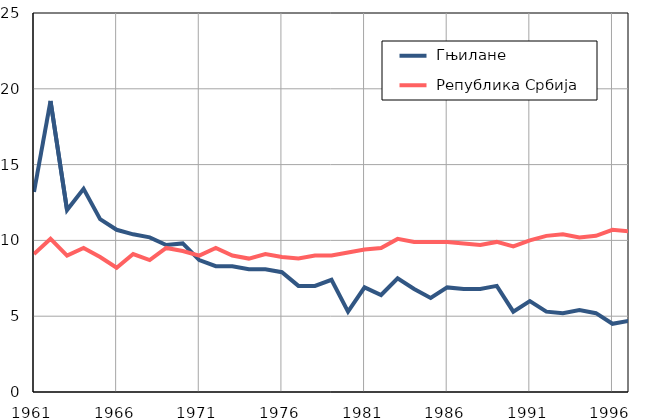
| Category |  Гњилане |  Република Србија |
|---|---|---|
| 1961.0 | 13.2 | 9.1 |
| 1962.0 | 19.2 | 10.1 |
| 1963.0 | 12 | 9 |
| 1964.0 | 13.4 | 9.5 |
| 1965.0 | 11.4 | 8.9 |
| 1966.0 | 10.7 | 8.2 |
| 1967.0 | 10.4 | 9.1 |
| 1968.0 | 10.2 | 8.7 |
| 1969.0 | 9.7 | 9.5 |
| 1970.0 | 9.8 | 9.3 |
| 1971.0 | 8.7 | 9 |
| 1972.0 | 8.3 | 9.5 |
| 1973.0 | 8.3 | 9 |
| 1974.0 | 8.1 | 8.8 |
| 1975.0 | 8.1 | 9.1 |
| 1976.0 | 7.9 | 8.9 |
| 1977.0 | 7 | 8.8 |
| 1978.0 | 7 | 9 |
| 1979.0 | 7.4 | 9 |
| 1980.0 | 5.3 | 9.2 |
| 1981.0 | 6.9 | 9.4 |
| 1982.0 | 6.4 | 9.5 |
| 1983.0 | 7.5 | 10.1 |
| 1984.0 | 6.8 | 9.9 |
| 1985.0 | 6.2 | 9.9 |
| 1986.0 | 6.9 | 9.9 |
| 1987.0 | 6.8 | 9.8 |
| 1988.0 | 6.8 | 9.7 |
| 1989.0 | 7 | 9.9 |
| 1990.0 | 5.3 | 9.6 |
| 1991.0 | 6 | 10 |
| 1992.0 | 5.3 | 10.3 |
| 1993.0 | 5.2 | 10.4 |
| 1994.0 | 5.4 | 10.2 |
| 1995.0 | 5.2 | 10.3 |
| 1996.0 | 4.5 | 10.7 |
| 1997.0 | 4.7 | 10.6 |